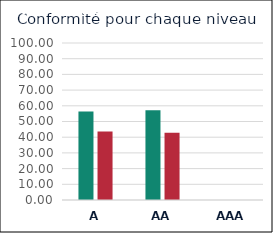
| Category | Series 0 | Series 1 |
|---|---|---|
| A | 56.364 | 43.636 |
| AA | 57.143 | 42.857 |
| AAA | 0 | 0 |